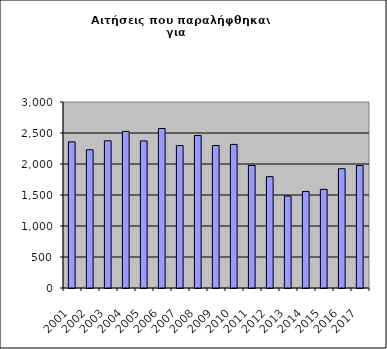
| Category | Series 1 |
|---|---|
| 2001.0 | 2357 |
| 2002.0 | 2230 |
| 2003.0 | 2375 |
| 2004.0 | 2525 |
| 2005.0 | 2372 |
| 2006.0 | 2572 |
| 2007.0 | 2297 |
| 2008.0 | 2460 |
| 2009.0 | 2298 |
| 2010.0 | 2316 |
| 2011.0 | 1977 |
| 2012.0 | 1796 |
| 2013.0 | 1483 |
| 2014.0 | 1558 |
| 2015.0 | 1591 |
| 2016.0 | 1924 |
| 2017.0 | 1975 |